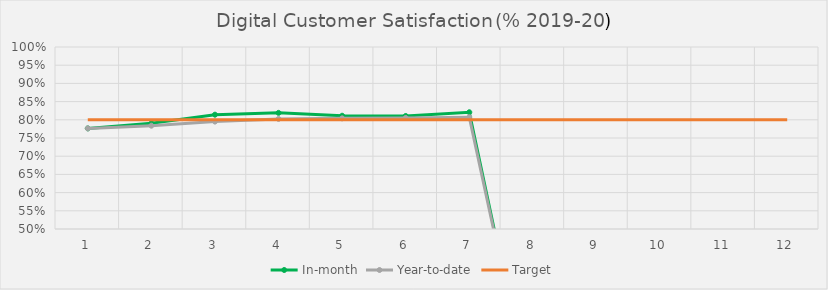
| Category | In-month | Year-to-date | Target |
|---|---|---|---|
| 0 | 0.776 | 0.776 | 0.8 |
| 1 | 0.791 | 0.784 | 0.8 |
| 2 | 0.814 | 0.795 | 0.8 |
| 3 | 0.819 | 0.802 | 0.8 |
| 4 | 0.811 | 0.804 | 0.8 |
| 5 | 0.811 | 0.805 | 0.8 |
| 6 | 0.821 | 0.807 | 0.8 |
| 7 | 0 | 0 | 0.8 |
| 8 | 0 | 0 | 0.8 |
| 9 | 0 | 0 | 0.8 |
| 10 | 0 | 0 | 0.8 |
| 11 | 0 | 0 | 0.8 |